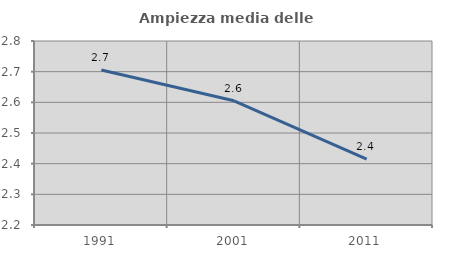
| Category | Ampiezza media delle famiglie |
|---|---|
| 1991.0 | 2.705 |
| 2001.0 | 2.605 |
| 2011.0 | 2.415 |